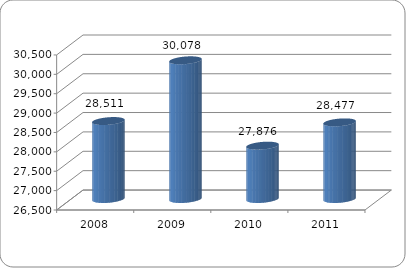
| Category | Počet ošetrených a vyšetrených |
|---|---|
| 2008.0 | 28511 |
| 2009.0 | 30078 |
| 2010.0 | 27876 |
| 2011.0 | 28477 |